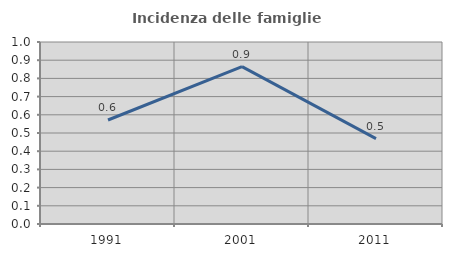
| Category | Incidenza delle famiglie numerose |
|---|---|
| 1991.0 | 0.571 |
| 2001.0 | 0.865 |
| 2011.0 | 0.469 |